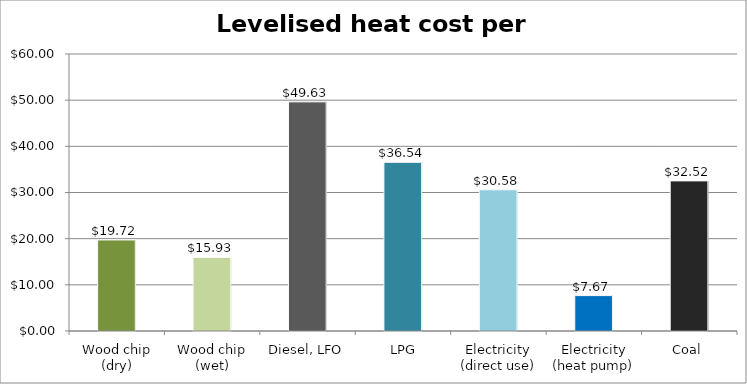
| Category | Series 0 |
|---|---|
| Wood chip (dry) | 19.72 |
| Wood chip (wet) | 15.93 |
| Diesel, LFO | 49.633 |
|  LPG | 36.538 |
| Electricity (direct use) | 30.58 |
| Electricity (heat pump) | 7.671 |
| Coal | 32.517 |